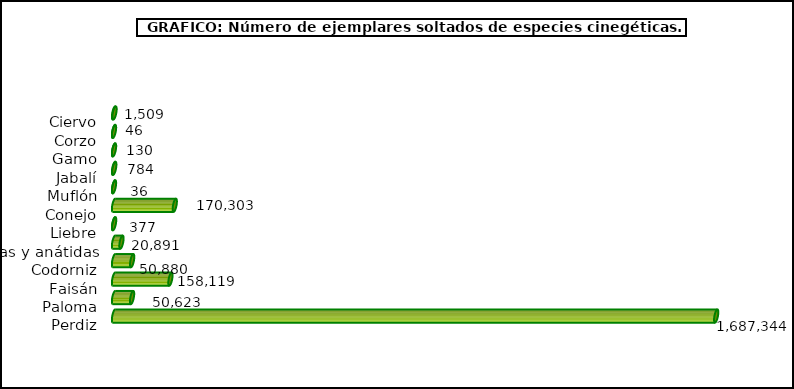
| Category | Series 1 |
|---|---|
| Ciervo | 1509 |
| Corzo | 46 |
| Gamo | 130 |
| Jabalí | 784 |
| Muflón | 36 |
| Conejo | 170303 |
| Liebre | 377 |
| Acuáticas y anátidas | 20891 |
| Codorniz | 50880 |
| Faisán | 158119 |
| Paloma | 50623 |
| Perdiz | 1687344 |